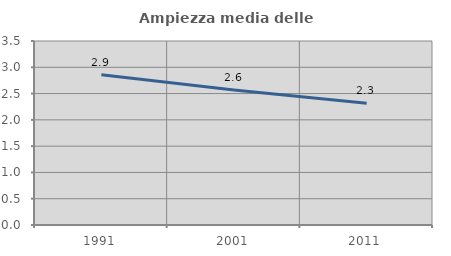
| Category | Ampiezza media delle famiglie |
|---|---|
| 1991.0 | 2.858 |
| 2001.0 | 2.567 |
| 2011.0 | 2.316 |